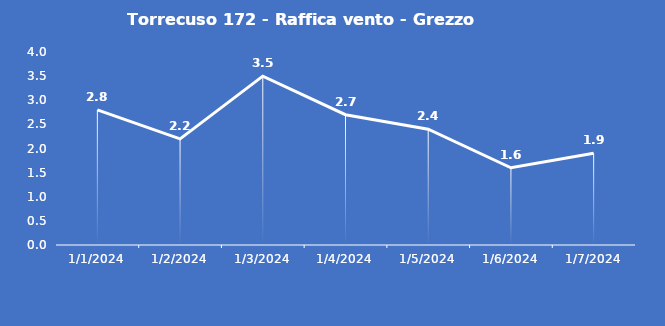
| Category | Torrecuso 172 - Raffica vento - Grezzo (m/s) |
|---|---|
| 1/1/24 | 2.8 |
| 1/2/24 | 2.2 |
| 1/3/24 | 3.5 |
| 1/4/24 | 2.7 |
| 1/5/24 | 2.4 |
| 1/6/24 | 1.6 |
| 1/7/24 | 1.9 |